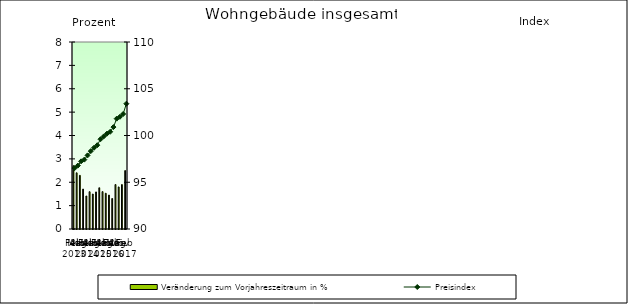
| Category | Veränderung zum Vorjahreszeitraum in % |
|---|---|
| 0 | 2.708 |
| 1 | 2.404 |
| 2 | 2.294 |
| 3 | 1.708 |
| 4 | 1.412 |
| 5 | 1.596 |
| 6 | 1.495 |
| 7 | 1.586 |
| 8 | 1.764 |
| 9 | 1.599 |
| 10 | 1.529 |
| 11 | 1.451 |
| 12 | 1.305 |
| 13 | 1.902 |
| 14 | 1.8 |
| 15 | 1.9 |
| 16 | 2.5 |